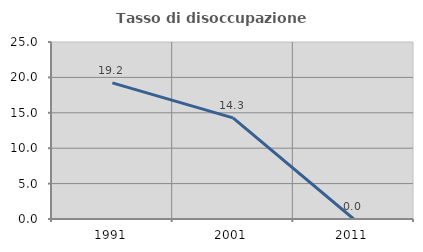
| Category | Tasso di disoccupazione giovanile  |
|---|---|
| 1991.0 | 19.231 |
| 2001.0 | 14.286 |
| 2011.0 | 0 |